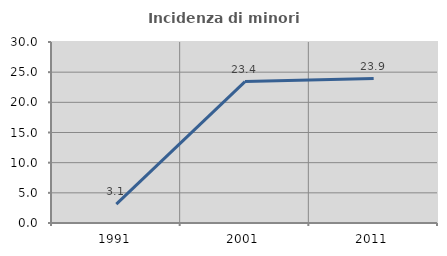
| Category | Incidenza di minori stranieri |
|---|---|
| 1991.0 | 3.125 |
| 2001.0 | 23.438 |
| 2011.0 | 23.936 |